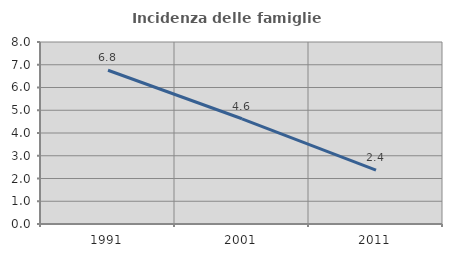
| Category | Incidenza delle famiglie numerose |
|---|---|
| 1991.0 | 6.757 |
| 2001.0 | 4.625 |
| 2011.0 | 2.364 |